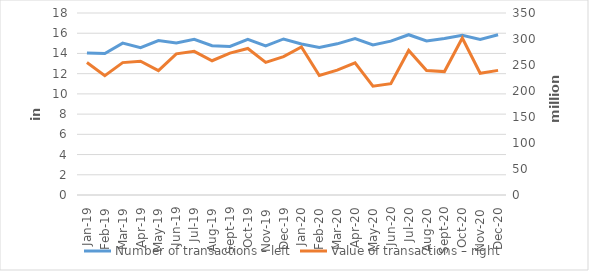
| Category | Number of transactions – left |
|---|---|
| sij.19 | 14051758 |
| Feb-19 | 13993705 |
| ožu.19 | 15018362 |
| tra.19 | 14573386 |
| svi.19 | 15274233 |
| lip.19 | 15041226 |
| srp.19 | 15403097 |
| kol.19 | 14762747 |
| ruj.19 | 14697605 |
| lis.19 | 15394413 |
| stu.19 | 14755458 |
| pro.19 | 15431812 |
| sij.20 | 14934534 |
| Feb-20 | 14581295 |
| ožu.20 | 14949924 |
| tra.20 | 15475047 |
| svi.20 | 14836361 |
| lip.20 | 15221341 |
| srp.20 | 15852587 |
| kol.20 | 15230743 |
| ruj.20 | 15480174 |
| lis.20 | 15793838 |
| stu.20 | 15391839 |
| pro.20 | 15841467 |